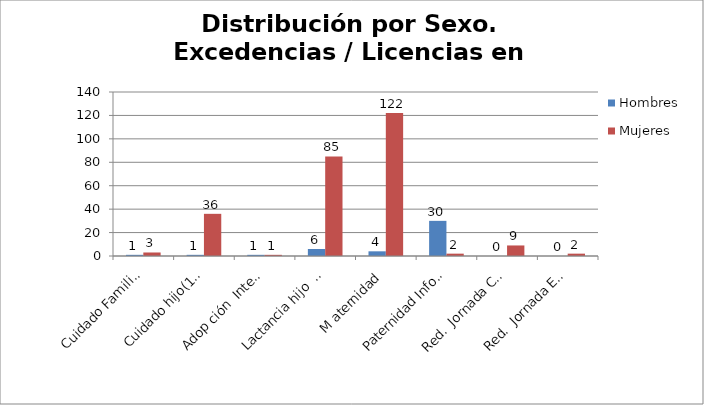
| Category | Hombres | Mujeres |
|---|---|---|
| Cuidado Familiar(hasta2ºgrado) | 1 | 3 |
| Cuidado hijo(1er y 2º año) | 1 | 36 |
| Adop ción  Internacional | 1 | 1 |
| Lactancia hijo  < 12 meses | 6 | 85 |
| M aternidad | 4 | 122 |
| Paternidad Informativo | 30 | 2 |
| Red.  Jornada Cuid  Hij/Fam | 0 | 9 |
| Red.  Jornada Enf  Gr. Fami | 0 | 2 |